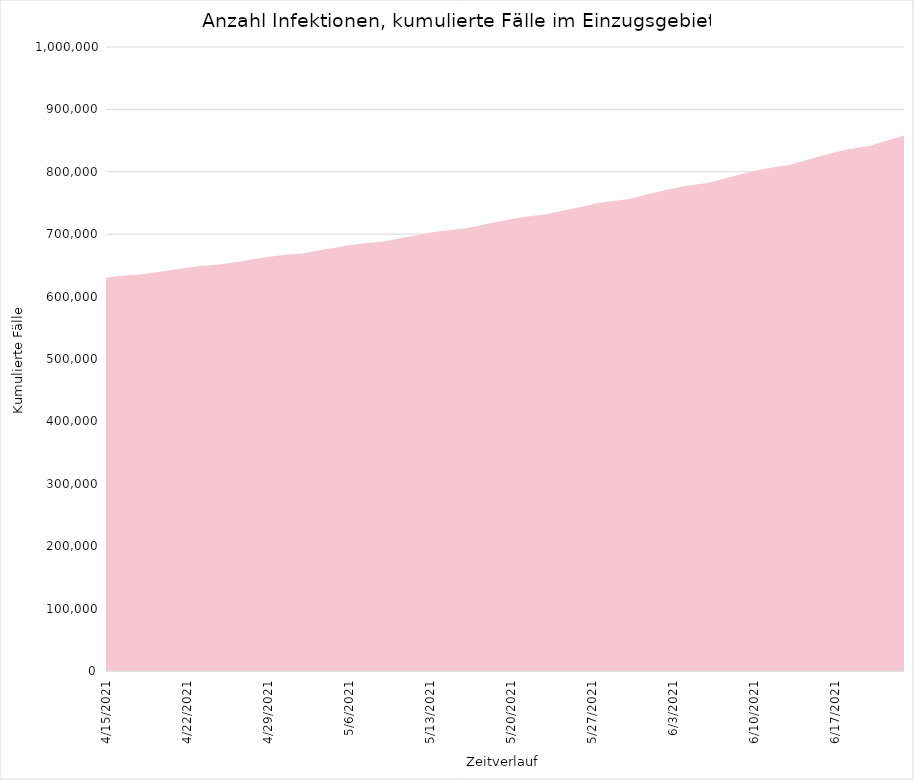
| Category | 630.078 |
|---|---|
| 4/15/21 | 630077.856 |
| 4/16/21 | 632585.937 |
| 4/17/21 | 634259.423 |
| 4/18/21 | 635454.196 |
| 4/19/21 | 638236.273 |
| 4/20/21 | 640793.661 |
| 4/21/21 | 643230.791 |
| 4/22/21 | 646121.106 |
| 4/23/21 | 648585.594 |
| 4/24/21 | 650361.012 |
| 4/25/21 | 651704.894 |
| 4/26/21 | 654563.653 |
| 4/27/21 | 657601.384 |
| 4/28/21 | 660505.032 |
| 4/29/21 | 663394.023 |
| 4/30/21 | 665886.344 |
| 5/1/21 | 667789.294 |
| 5/2/21 | 669250.716 |
| 5/3/21 | 672474.306 |
| 5/4/21 | 675850.89 |
| 5/5/21 | 678926.947 |
| 5/6/21 | 681986.576 |
| 5/7/21 | 684703.675 |
| 5/8/21 | 686774.331 |
| 5/9/21 | 688340.845 |
| 5/10/21 | 691832.876 |
| 5/11/21 | 695462.097 |
| 5/12/21 | 698786.817 |
| 5/13/21 | 702148.435 |
| 5/14/21 | 705108.664 |
| 5/15/21 | 707330.512 |
| 5/16/21 | 709009.175 |
| 5/17/21 | 712778.294 |
| 5/18/21 | 716714.59 |
| 5/19/21 | 720334.533 |
| 5/20/21 | 723987.802 |
| 5/21/21 | 727181.992 |
| 5/22/21 | 729579.348 |
| 5/23/21 | 731397.59 |
| 5/24/21 | 735480.865 |
| 5/25/21 | 739743.919 |
| 5/26/21 | 743661.467 |
| 5/27/21 | 747613.441 |
| 5/28/21 | 751073.341 |
| 5/29/21 | 753674.48 |
| 5/30/21 | 755645.703 |
| 5/31/21 | 760063.744 |
| 6/1/21 | 764675.581 |
| 6/2/21 | 768917.16 |
| 6/3/21 | 773200.439 |
| 6/4/21 | 776953.089 |
| 6/5/21 | 779772.88 |
| 6/6/21 | 781908.017 |
| 6/7/21 | 786693.477 |
| 6/8/21 | 791691.489 |
| 6/9/21 | 796289.609 |
| 6/10/21 | 800932.875 |
| 6/11/21 | 805000.54 |
| 6/12/21 | 808056.943 |
| 6/13/21 | 810371.865 |
| 6/14/21 | 815561.792 |
| 6/15/21 | 820981.944 |
| 6/16/21 | 825967.594 |
| 6/17/21 | 831002.154 |
| 6/18/21 | 835413.39 |
| 6/19/21 | 838728.764 |
| 6/20/21 | 841240.217 |
| 6/21/21 | 846870.667 |
| 6/22/21 | 852750.527 |
| 6/23/21 | 858159.352 |